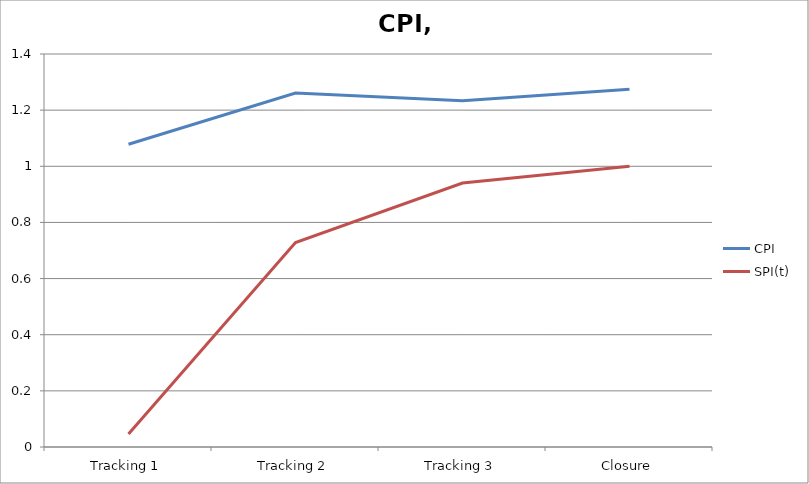
| Category | CPI | SPI(t) |
|---|---|---|
| Tracking 1 | 1.078 | 0.046 |
| Tracking 2 | 1.261 | 0.728 |
| Tracking 3 | 1.234 | 0.94 |
| Closure | 1.275 | 1 |